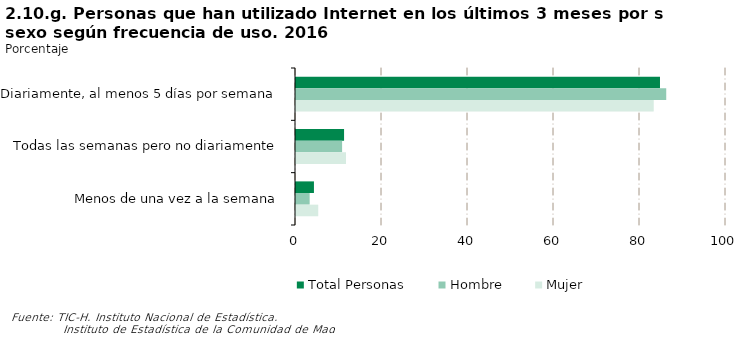
| Category | Total Personas | Hombre | Mujer |
|---|---|---|---|
| Diariamente, al menos 5 días por semana | 84.649 | 86.1 | 83.194 |
| Todas las semanas pero no diariamente | 11.178 | 10.723 | 11.634 |
| Menos de una vez a la semana | 4.173 | 3.177 | 5.172 |